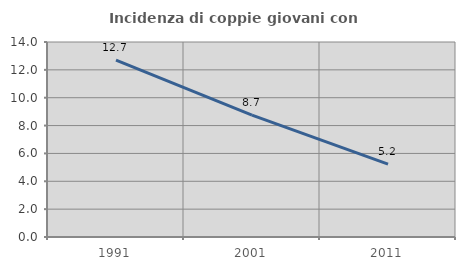
| Category | Incidenza di coppie giovani con figli |
|---|---|
| 1991.0 | 12.704 |
| 2001.0 | 8.744 |
| 2011.0 | 5.232 |